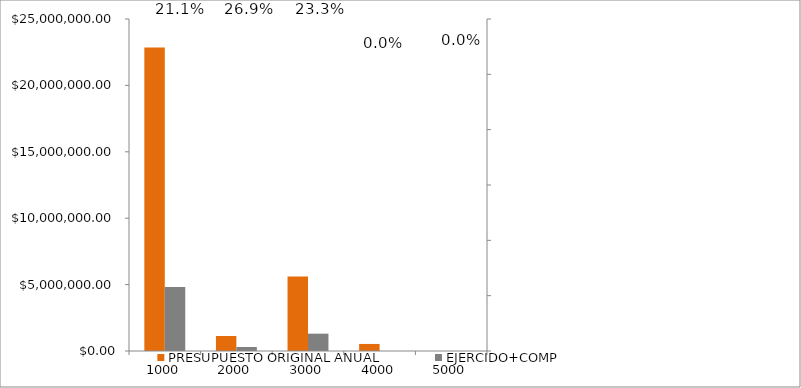
| Category | PRESUPUESTO ORIGINAL ANUAL | EJERCIDO+COMP |
|---|---|---|
| 1000.0 | 22862456 | 4818958.96 |
| 2000.0 | 1128884 | 303117.67 |
| 3000.0 | 5604895 | 1305306.35 |
| 4000.0 | 530650 | 0 |
| 5000.0 | 0 | 0 |